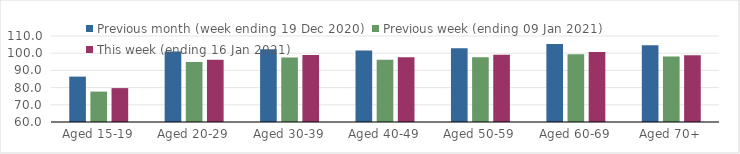
| Category | Previous month (week ending 19 Dec 2020) | Previous week (ending 09 Jan 2021) | This week (ending 16 Jan 2021) |
|---|---|---|---|
| Aged 15-19 | 86.39 | 77.68 | 79.7 |
| Aged 20-29 | 101.06 | 94.82 | 96.16 |
| Aged 30-39 | 102.32 | 97.51 | 98.91 |
| Aged 40-49 | 101.62 | 96.19 | 97.59 |
| Aged 50-59 | 102.95 | 97.6 | 99.17 |
| Aged 60-69 | 105.4 | 99.35 | 100.74 |
| Aged 70+ | 104.64 | 98.01 | 98.78 |